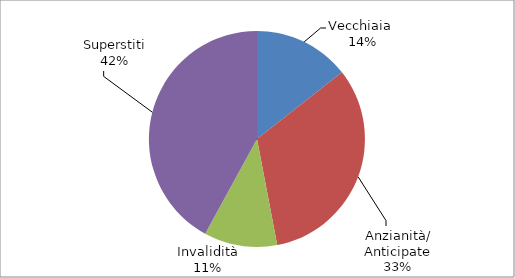
| Category | Series 0 |
|---|---|
| Vecchiaia  | 34000 |
| Anzianità/ Anticipate | 76988 |
| Invalidità | 25901 |
| Superstiti | 99245 |